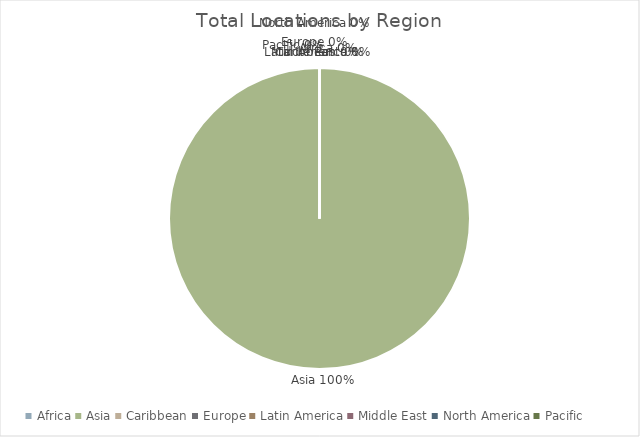
| Category | Series 0 |
|---|---|
| Africa | 0 |
| Asia | 1 |
| Caribbean | 0 |
| Europe | 0 |
| Latin America | 0 |
| Middle East | 0 |
| North America | 0 |
| Pacific | 0 |